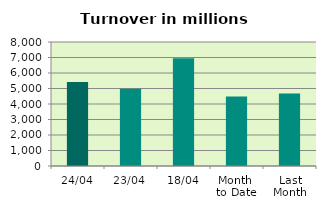
| Category | Series 0 |
|---|---|
| 24/04 | 5411.318 |
| 23/04 | 4990.668 |
| 18/04 | 6958.836 |
| Month 
to Date | 4480.023 |
| Last
Month | 4683.179 |